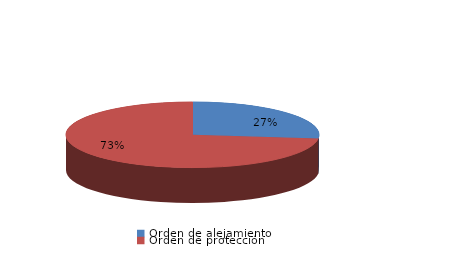
| Category | Series 0 |
|---|---|
| Orden de alejamiento | 185 |
| Orden de protección | 506 |